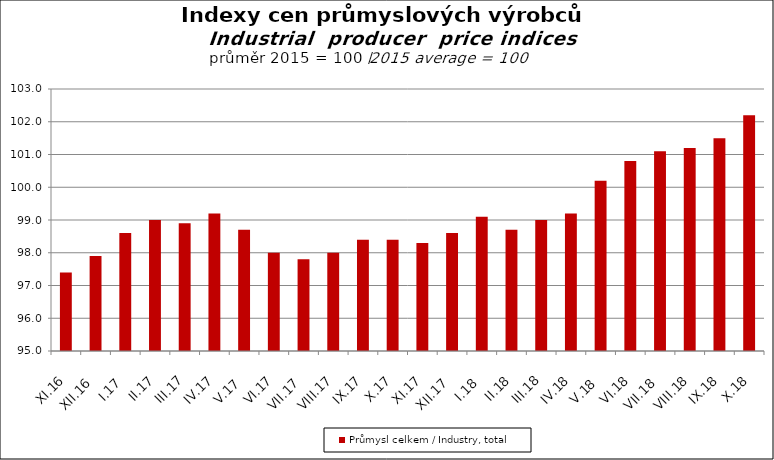
| Category | Průmysl celkem / Industry, total |
|---|---|
| XI.16 | 97.4 |
| XII.16 | 97.9 |
| I.17 | 98.6 |
| II.17 | 99 |
| III.17 | 98.9 |
| IV.17 | 99.2 |
| V.17 | 98.7 |
| VI.17 | 98 |
| VII.17 | 97.8 |
| VIII.17 | 98 |
| IX.17 | 98.4 |
| X.17 | 98.4 |
| XI.17 | 98.3 |
| XII.17 | 98.6 |
| I.18 | 99.1 |
| II.18 | 98.7 |
| III.18 | 99 |
| IV.18 | 99.2 |
| V.18 | 100.2 |
| VI.18 | 100.8 |
| VII.18 | 101.1 |
| VIII.18 | 101.2 |
| IX.18 | 101.5 |
| X.18 | 102.2 |